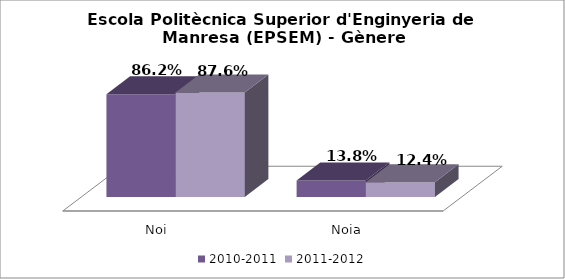
| Category | 2010-2011 | 2011-2012 |
|---|---|---|
| Noi | 0.862 | 0.876 |
| Noia | 0.138 | 0.124 |